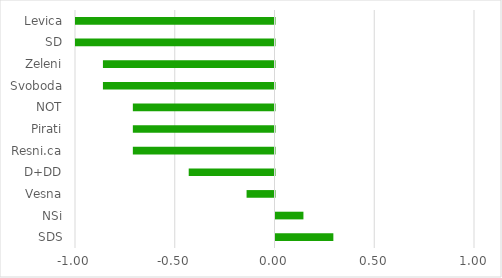
| Category | Series 0 |
|---|---|
| SDS | 0.29 |
| NSi | 0.14 |
| Vesna | -0.14 |
| D+DD | -0.43 |
| Resni.ca | -0.71 |
| Pirati | -0.71 |
| NOT | -0.71 |
| Svoboda | -0.86 |
| Zeleni | -0.86 |
| SD | -1 |
| Levica | -1 |